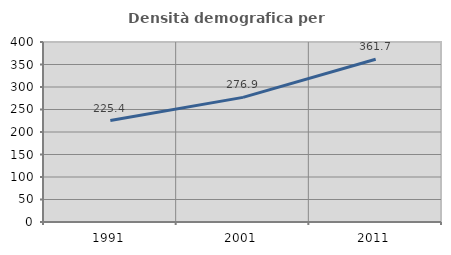
| Category | Densità demografica |
|---|---|
| 1991.0 | 225.398 |
| 2001.0 | 276.903 |
| 2011.0 | 361.669 |